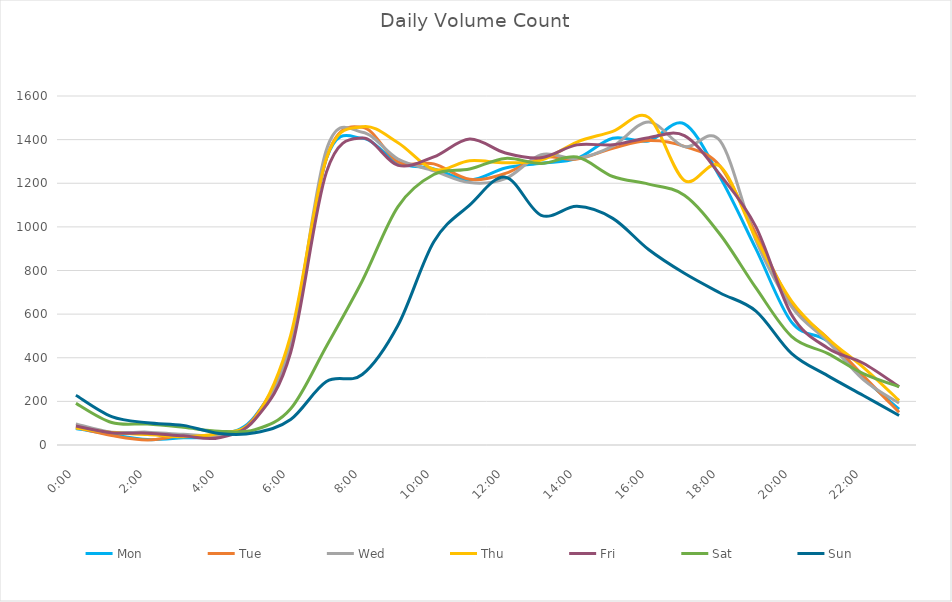
| Category | Mon | Tue | Wed | Thu | Fri | Sat | Sun |
|---|---|---|---|---|---|---|---|
| 0.0 | 76 | 81 | 97 | 78 | 87 | 191 | 228 |
| 0.0416666666666667 | 48 | 44 | 59 | 57 | 56 | 103 | 130 |
| 0.0833333333333333 | 25 | 23 | 59 | 48 | 54 | 96 | 102 |
| 0.125 | 33 | 43 | 49 | 38 | 42 | 81 | 90 |
| 0.166666666666667 | 44 | 41 | 47 | 54 | 33 | 63 | 53 |
| 0.208333333333333 | 131 | 127 | 118 | 122 | 117 | 70 | 56 |
| 0.25 | 470 | 483 | 463 | 502 | 424 | 166 | 117 |
| 0.291666666666667 | 1313 | 1315 | 1354 | 1315 | 1251 | 453 | 291 |
| 0.333333333333333 | 1406 | 1457 | 1434 | 1459 | 1407 | 752 | 323 |
| 0.375 | 1295 | 1298 | 1311 | 1386 | 1282 | 1093 | 549 |
| 0.416666666666667 | 1266 | 1289 | 1257 | 1263 | 1321 | 1240 | 932 |
| 0.4583333333333333 | 1215 | 1218 | 1203 | 1303 | 1403 | 1265 | 1100 |
| 0.5 | 1270 | 1245 | 1221 | 1294 | 1339 | 1314 | 1228 |
| 0.541666666666667 | 1292 | 1319 | 1331 | 1306 | 1317 | 1291 | 1053 |
| 0.5833333333333334 | 1314 | 1311 | 1314 | 1389 | 1376 | 1320 | 1094 |
| 0.625 | 1406 | 1360 | 1370 | 1438 | 1376 | 1231 | 1039 |
| 0.666666666666667 | 1394 | 1396 | 1481 | 1502 | 1409 | 1196 | 896 |
| 0.7083333333333334 | 1472 | 1369 | 1368 | 1213 | 1418 | 1145 | 787 |
| 0.75 | 1227 | 1278 | 1394 | 1277 | 1238 | 965 | 697 |
| 0.791666666666667 | 899 | 967 | 938 | 948 | 1000 | 720 | 614 |
| 0.8333333333333334 | 562 | 648 | 633 | 659 | 596 | 497 | 419 |
| 0.875 | 477 | 490 | 476 | 489 | 445 | 420 | 318 |
| 0.916666666666667 | 307 | 317 | 300 | 356 | 375 | 327 | 227 |
| 0.9583333333333334 | 164 | 150 | 192 | 204 | 267 | 267 | 135 |